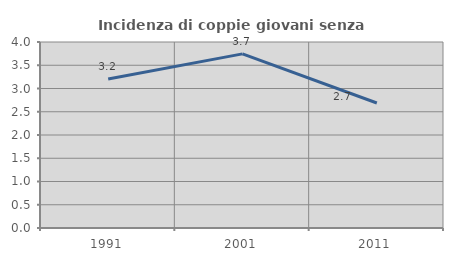
| Category | Incidenza di coppie giovani senza figli |
|---|---|
| 1991.0 | 3.205 |
| 2001.0 | 3.744 |
| 2011.0 | 2.688 |